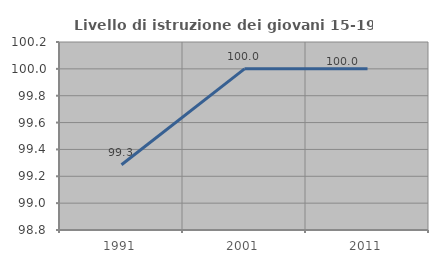
| Category | Livello di istruzione dei giovani 15-19 anni |
|---|---|
| 1991.0 | 99.286 |
| 2001.0 | 100 |
| 2011.0 | 100 |